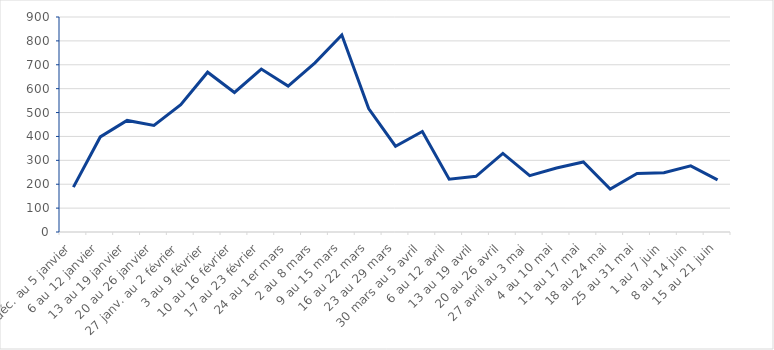
| Category | Series 0 |
|---|---|
| 30 déc. au 5 janvier | 188 |
| 6 au 12 janvier | 398 |
| 13 au 19 janvier | 467 |
| 20 au 26 janvier | 446 |
| 27 janv. au 2 février | 533 |
| 3 au 9 février | 669 |
| 10 au 16 février | 584 |
| 17 au 23 février | 682 |
| 24 au 1er mars | 611 |
| 2 au 8 mars | 708 |
| 9 au 15 mars | 825 |
| 16 au 22 mars | 517 |
| 23 au 29 mars | 359 |
| 30 mars au 5 avril | 421 |
| 6 au 12 avril | 221 |
| 13 au 19 avril | 233 |
| 20 au 26 avril | 329 |
| 27 avril au 3 mai | 236 |
| 4 au 10 mai | 268 |
| 11 au 17 mai | 293 |
| 18 au 24 mai | 180 |
| 25 au 31 mai | 245 |
| 1 au 7 juin | 248 |
| 8 au 14 juin | 277 |
| 15 au 21 juin | 218 |